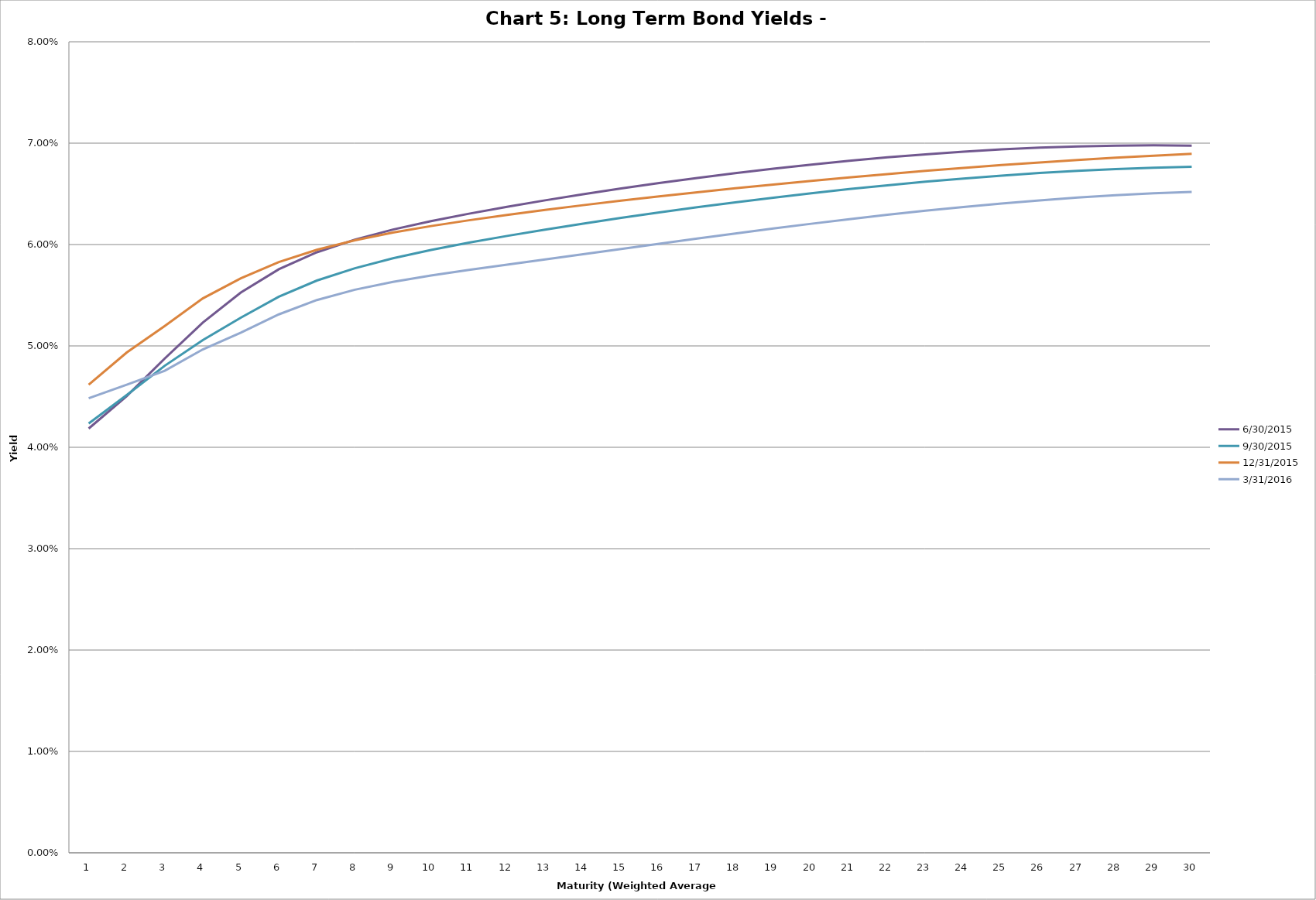
| Category | 6/30/2015 | 9/30/2015 | 12/31/2015 | 3/31/2016 |
|---|---|---|---|---|
| 0 | 0.042 | 0.042 | 0.046 | 0.045 |
| 1 | 0.045 | 0.045 | 0.049 | 0.046 |
| 2 | 0.049 | 0.048 | 0.052 | 0.048 |
| 3 | 0.052 | 0.051 | 0.055 | 0.05 |
| 4 | 0.055 | 0.053 | 0.057 | 0.051 |
| 5 | 0.058 | 0.055 | 0.058 | 0.053 |
| 6 | 0.059 | 0.056 | 0.059 | 0.055 |
| 7 | 0.06 | 0.058 | 0.06 | 0.056 |
| 8 | 0.061 | 0.059 | 0.061 | 0.056 |
| 9 | 0.062 | 0.059 | 0.062 | 0.057 |
| 10 | 0.063 | 0.06 | 0.062 | 0.057 |
| 11 | 0.064 | 0.061 | 0.063 | 0.058 |
| 12 | 0.064 | 0.061 | 0.063 | 0.059 |
| 13 | 0.065 | 0.062 | 0.064 | 0.059 |
| 14 | 0.066 | 0.063 | 0.064 | 0.06 |
| 15 | 0.066 | 0.063 | 0.065 | 0.06 |
| 16 | 0.067 | 0.064 | 0.065 | 0.061 |
| 17 | 0.067 | 0.064 | 0.066 | 0.061 |
| 18 | 0.067 | 0.065 | 0.066 | 0.062 |
| 19 | 0.068 | 0.065 | 0.066 | 0.062 |
| 20 | 0.068 | 0.065 | 0.067 | 0.063 |
| 21 | 0.069 | 0.066 | 0.067 | 0.063 |
| 22 | 0.069 | 0.066 | 0.067 | 0.063 |
| 23 | 0.069 | 0.067 | 0.068 | 0.064 |
| 24 | 0.069 | 0.067 | 0.068 | 0.064 |
| 25 | 0.07 | 0.067 | 0.068 | 0.064 |
| 26 | 0.07 | 0.067 | 0.068 | 0.065 |
| 27 | 0.07 | 0.067 | 0.069 | 0.065 |
| 28 | 0.07 | 0.068 | 0.069 | 0.065 |
| 29 | 0.07 | 0.068 | 0.069 | 0.065 |